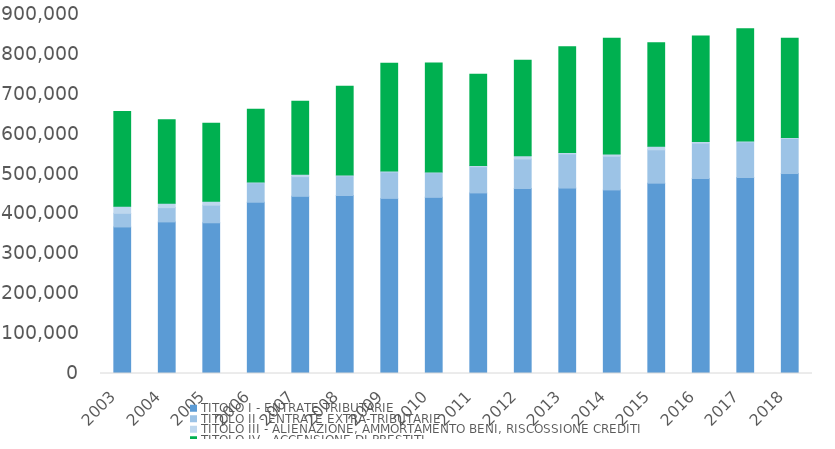
| Category | TITOLO I - ENTRATE TRIBUTARIE | TITOLO II - ENTRATE EXTRA-TRIBUTARIE | TITOLO III - ALIENAZIONE, AMMORTAMENTO BENI, RISCOSSIONE CREDITI | TITOLO IV - ACCENSIONE DI PRESTITI |
|---|---|---|---|---|
| 2003.0 | 367408 | 34150 | 17949 | 237530 |
| 2004.0 | 380062 | 35715 | 10992 | 209685 |
| 2005.0 | 377854 | 44105 | 10075 | 195380 |
| 2006.0 | 429363 | 48759 | 1921 | 182127 |
| 2007.0 | 444168 | 49382 | 6121 | 182747 |
| 2008.0 | 446165 | 49400 | 2182 | 222489 |
| 2009.0 | 439017 | 66150 | 2630 | 269718 |
| 2010.0 | 441614 | 61791 | 1921 | 272921 |
| 2011.0 | 452731.044 | 65697.905 | 3313.451 | 228422.129 |
| 2012.0 | 463768.62 | 74075.721 | 7946.719 | 239783.649 |
| 2013.0 | 464884.401 | 85665.455 | 3441.99 | 264846.999 |
| 2014.0 | 460253.424 | 84387.467 | 5545.741 | 289972.991 |
| 2015.0 | 477177.749 | 83602.841 | 8785.048 | 259542.417 |
| 2016.0 | 488794.687 | 88691.962 | 3828.358 | 264618.209 |
| 2017.0 | 491417.598 | 89081.525 | 2475.107 | 281609.658 |
| 2018.0 | 501300.352 | 88110.76 | 2200.483 | 249065.559 |